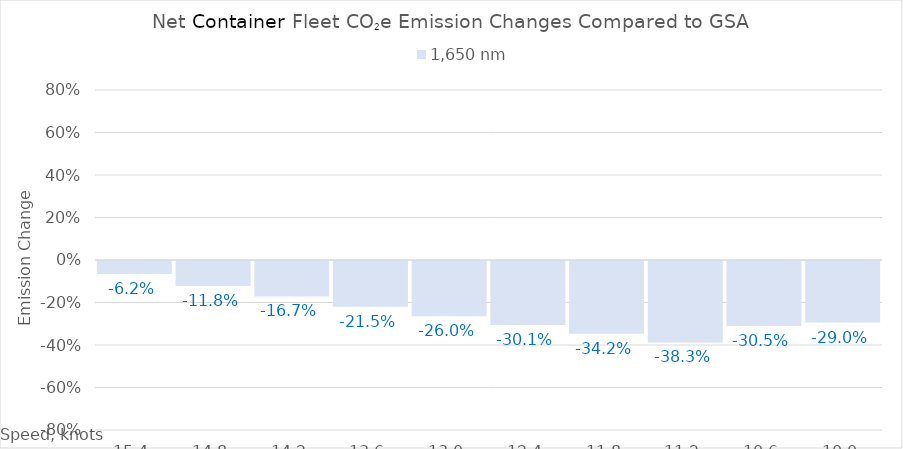
| Category | 1,650 |
|---|---|
| 15.4 | -0.062 |
| 14.8 | -0.118 |
| 14.200000000000001 | -0.167 |
| 13.600000000000001 | -0.215 |
| 13.000000000000002 | -0.26 |
| 12.400000000000002 | -0.301 |
| 11.800000000000002 | -0.342 |
| 11.200000000000003 | -0.383 |
| 10.600000000000003 | -0.305 |
| 10.000000000000004 | -0.29 |